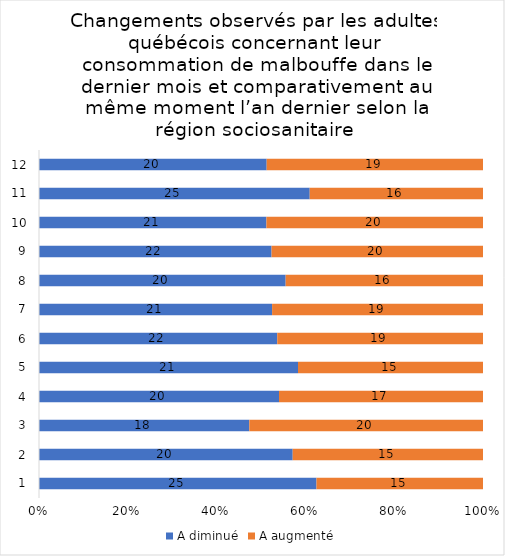
| Category | A diminué | A augmenté |
|---|---|---|
| 0 | 25 | 15 |
| 1 | 20 | 15 |
| 2 | 18 | 20 |
| 3 | 20 | 17 |
| 4 | 21 | 15 |
| 5 | 22 | 19 |
| 6 | 21 | 19 |
| 7 | 20 | 16 |
| 8 | 22 | 20 |
| 9 | 21 | 20 |
| 10 | 25 | 16 |
| 11 | 20 | 19 |